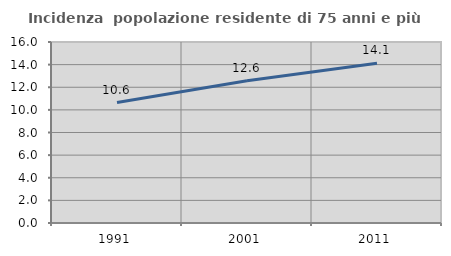
| Category | Incidenza  popolazione residente di 75 anni e più |
|---|---|
| 1991.0 | 10.648 |
| 2001.0 | 12.568 |
| 2011.0 | 14.12 |